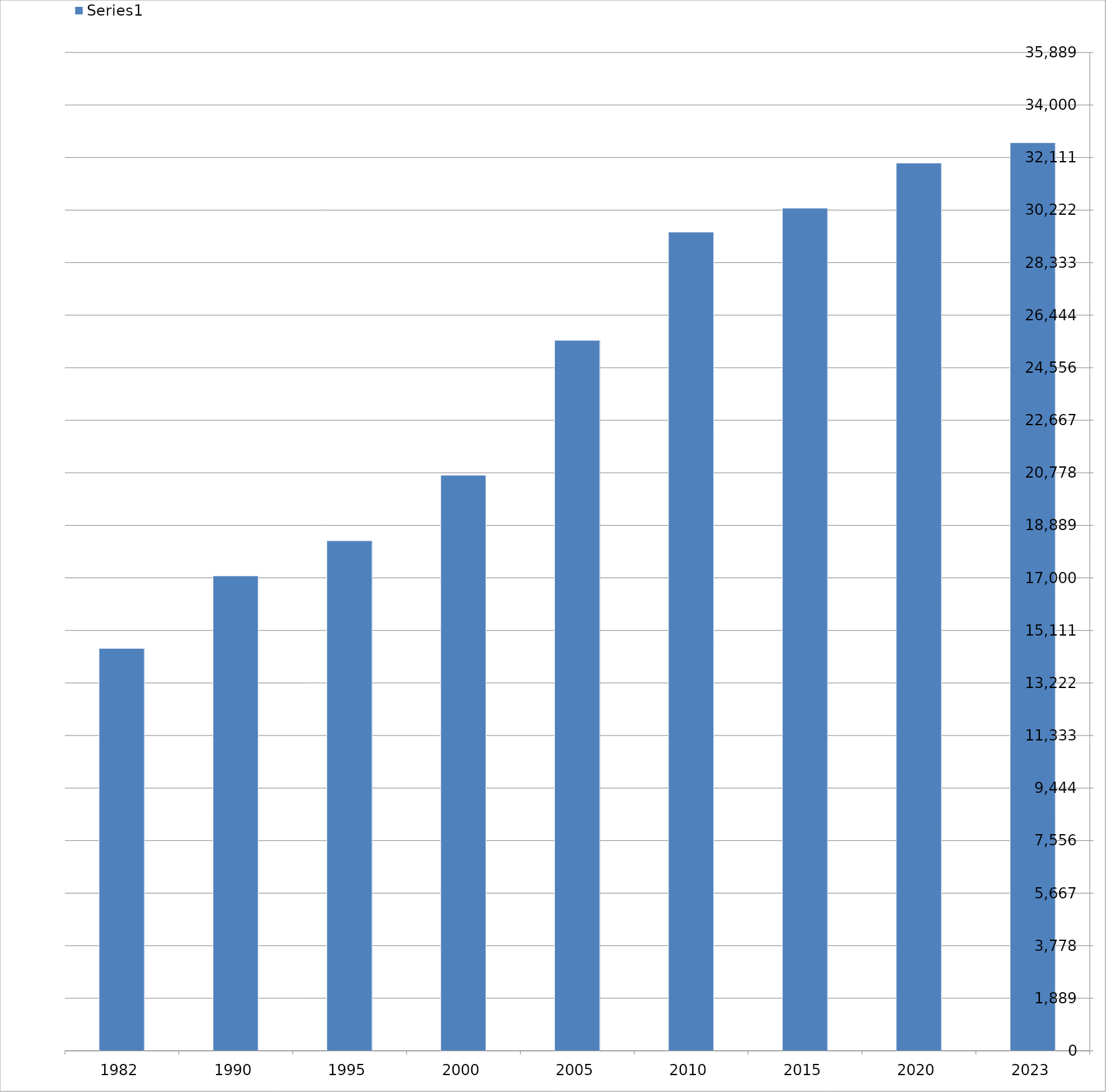
| Category | Series 0 |
|---|---|
| 2023 | 32643 |
| 2020 | 31914 |
| 2015 | 30294 |
| 2010 | 29431 |
| 2005 | 25541 |
| 2000 | 20692 |
| 1995 | 18337 |
| 1990 | 17075 |
| 1982 | 14466 |